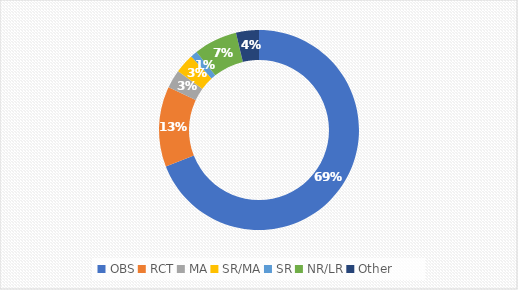
| Category | Number of Articles |
|---|---|
| OBS | 373 |
| RCT | 70 |
| MA | 16 |
| SR/MA | 17 |
| SR | 6 |
| NR/LR | 38 |
| Other | 20 |